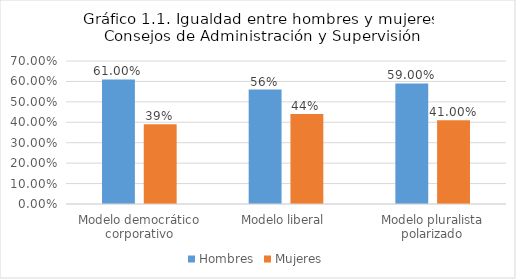
| Category | Hombres | Mujeres |
|---|---|---|
| Modelo democrático corporativo | 0.61 | 0.39 |
| Modelo liberal | 0.56 | 0.44 |
| Modelo pluralista polarizado | 0.59 | 0.41 |